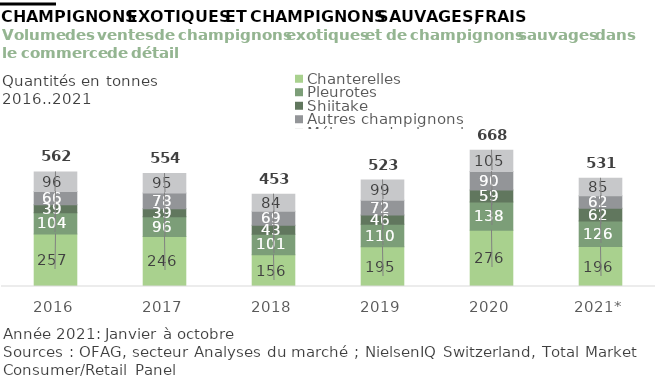
| Category | Chanterelles | Pleurotes | Shiitake | Autres champignons | Mélanges de champignons |
|---|---|---|---|---|---|
| 2016 | 257.369 | 104.295 | 39.198 | 65.661 | 95.661 |
| 2017 | 245.93 | 96.161 | 39.475 | 77.731 | 94.701 |
| 2018 | 156.232 | 100.629 | 43.206 | 69.285 | 83.64 |
| 2019 | 194.794 | 110.383 | 45.873 | 72.346 | 99.123 |
| 2020 | 276.199 | 138.348 | 59.027 | 90.359 | 104.554 |
| 2021* | 195.929 | 126.04 | 61.774 | 62.067 | 85.351 |